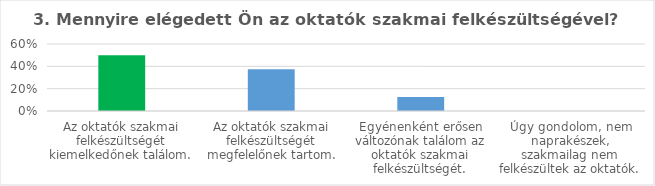
| Category | Series 0 |
|---|---|
| Az oktatók szakmai felkészültségét kiemelkedőnek találom. | 0.5 |
| Az oktatók szakmai felkészültségét megfelelőnek tartom. | 0.375 |
| Egyénenként erősen változónak találom az oktatók szakmai felkészültségét. | 0.125 |
| Úgy gondolom, nem naprakészek, szakmailag nem felkészültek az oktatók. | 0 |